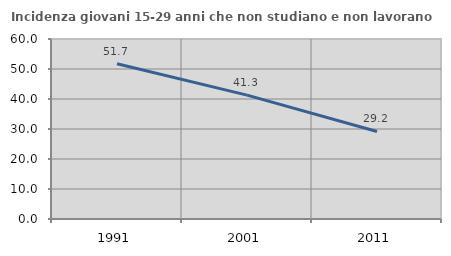
| Category | Incidenza giovani 15-29 anni che non studiano e non lavorano  |
|---|---|
| 1991.0 | 51.724 |
| 2001.0 | 41.304 |
| 2011.0 | 29.185 |